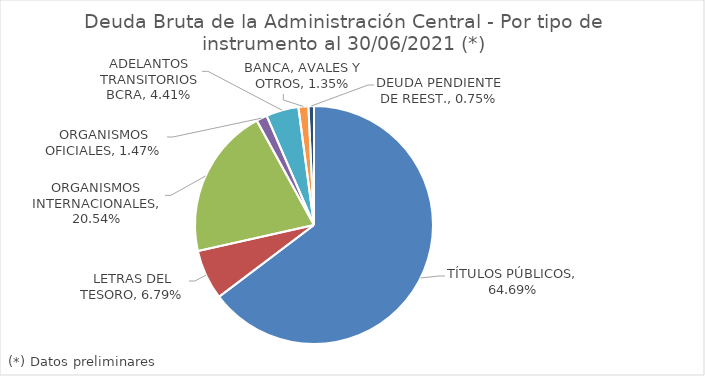
| Category | Series 0 |
|---|---|
| TÍTULOS PÚBLICOS | 0.647 |
| LETRAS DEL TESORO | 0.068 |
| ORGANISMOS INTERNACIONALES | 0.205 |
| ORGANISMOS OFICIALES | 0.015 |
| ADELANTOS TRANSITORIOS BCRA | 0.044 |
| BANCA, AVALES Y OTROS | 0.014 |
| DEUDA PENDIENTE DE REEST. | 0.008 |